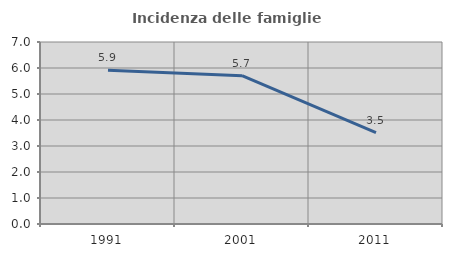
| Category | Incidenza delle famiglie numerose |
|---|---|
| 1991.0 | 5.914 |
| 2001.0 | 5.704 |
| 2011.0 | 3.518 |